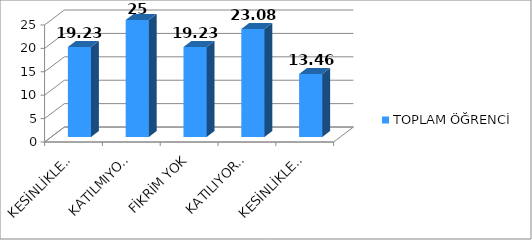
| Category | TOPLAM ÖĞRENCİ |
|---|---|
| KESİNLİKLE KATILMIYORUM | 19.23 |
| KATILMIYORUM | 25 |
| FİKRİM YOK | 19.23 |
| KATILIYORUM | 23.08 |
| KESİNLİKLE KATILIYORUM | 13.46 |